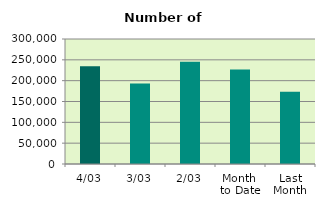
| Category | Series 0 |
|---|---|
| 4/03 | 234316 |
| 3/03 | 193204 |
| 2/03 | 245332 |
| Month 
to Date | 226983 |
| Last
Month | 173197.3 |